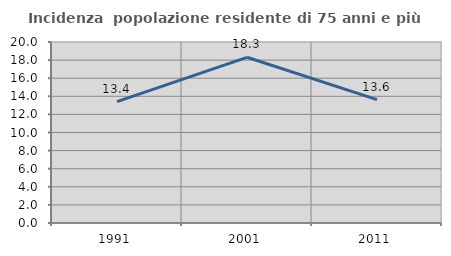
| Category | Incidenza  popolazione residente di 75 anni e più |
|---|---|
| 1991.0 | 13.415 |
| 2001.0 | 18.31 |
| 2011.0 | 13.636 |